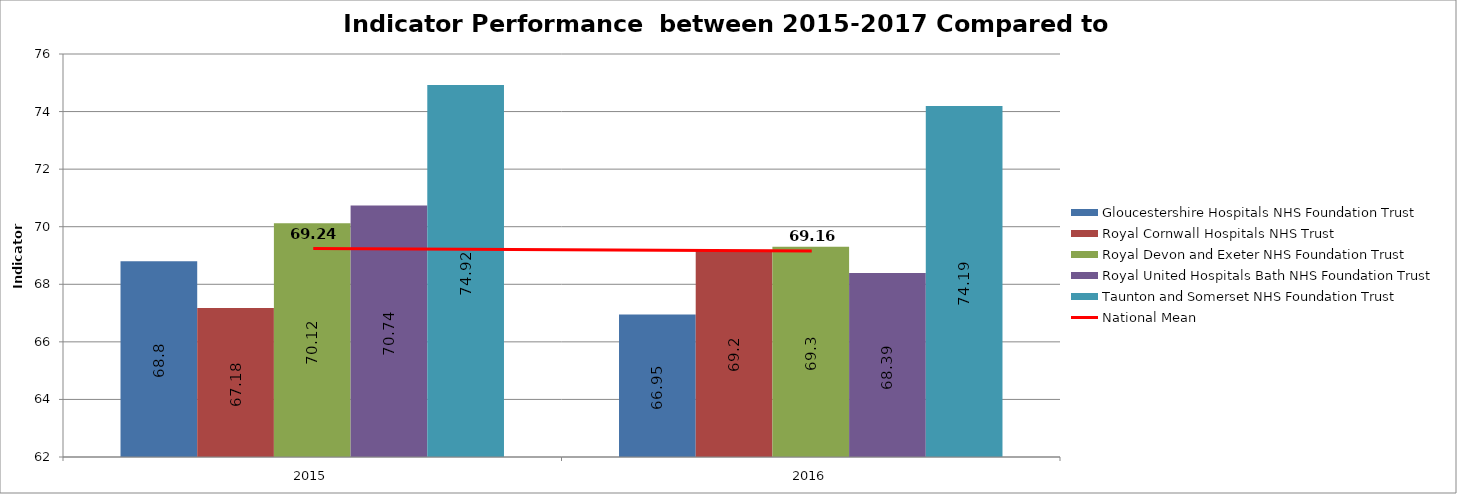
| Category | Gloucestershire Hospitals NHS Foundation Trust | Royal Cornwall Hospitals NHS Trust | Royal Devon and Exeter NHS Foundation Trust | Royal United Hospitals Bath NHS Foundation Trust | Taunton and Somerset NHS Foundation Trust |
|---|---|---|---|---|---|
| 2015 | 68.8 | 67.18 | 70.12 | 70.74 | 74.92 |
| 2016 | 66.95 | 69.2 | 69.3 | 68.39 | 74.19 |